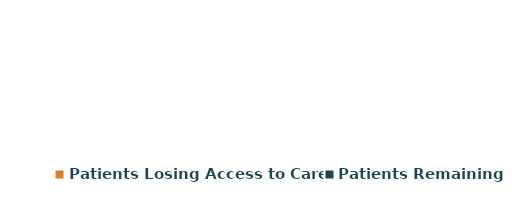
| Category | Series 0 |
|---|---|
| Patients Losing Access to Care | 0 |
| Patients Remaining | 0 |